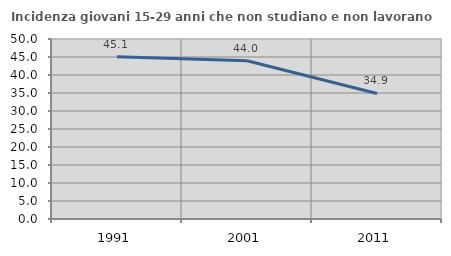
| Category | Incidenza giovani 15-29 anni che non studiano e non lavorano  |
|---|---|
| 1991.0 | 45.093 |
| 2001.0 | 43.95 |
| 2011.0 | 34.868 |